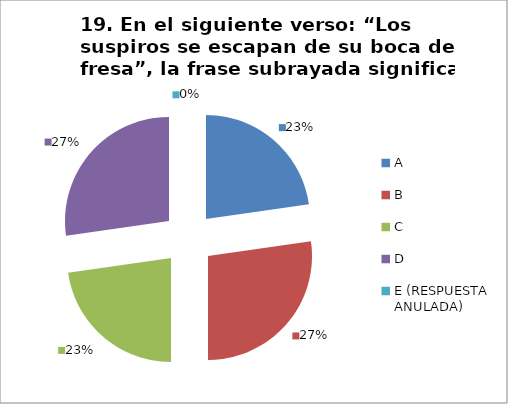
| Category | CANTIDAD DE RESPUESTAS PREGUNTA (19) | PORCENTAJE |
|---|---|---|
| A | 5 | 0.227 |
| B | 6 | 0.273 |
| C | 5 | 0.227 |
| D | 6 | 0.273 |
| E (RESPUESTA ANULADA) | 0 | 0 |